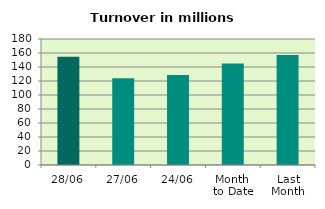
| Category | Series 0 |
|---|---|
| 28/06 | 154.68 |
| 27/06 | 124.06 |
| 24/06 | 128.551 |
| Month 
to Date | 144.986 |
| Last
Month | 157.265 |